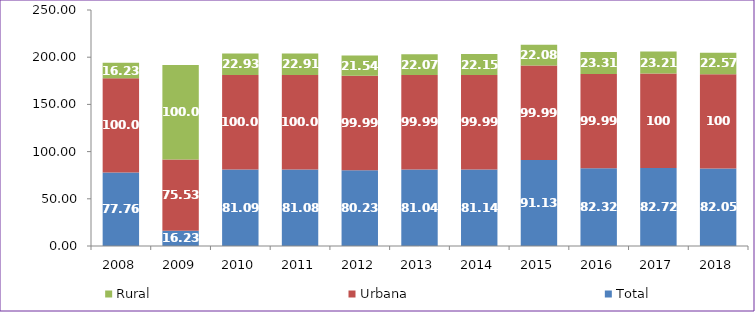
| Category | Total | Urbana | Rural |
|---|---|---|---|
| 2008.0 | 77.76 | 100 | 16.23 |
| 2009.0 | 16.23 | 75.53 | 100 |
| 2010.0 | 81.09 | 100 | 22.93 |
| 2011.0 | 81.08 | 100 | 22.91 |
| 2012.0 | 80.23 | 99.99 | 21.54 |
| 2013.0 | 81.04 | 99.99 | 22.07 |
| 2014.0 | 81.14 | 99.99 | 22.15 |
| 2015.0 | 91.13 | 99.99 | 22.08 |
| 2016.0 | 82.32 | 99.99 | 23.31 |
| 2017.0 | 82.72 | 100 | 23.21 |
| 2018.0 | 82.05 | 100 | 22.57 |